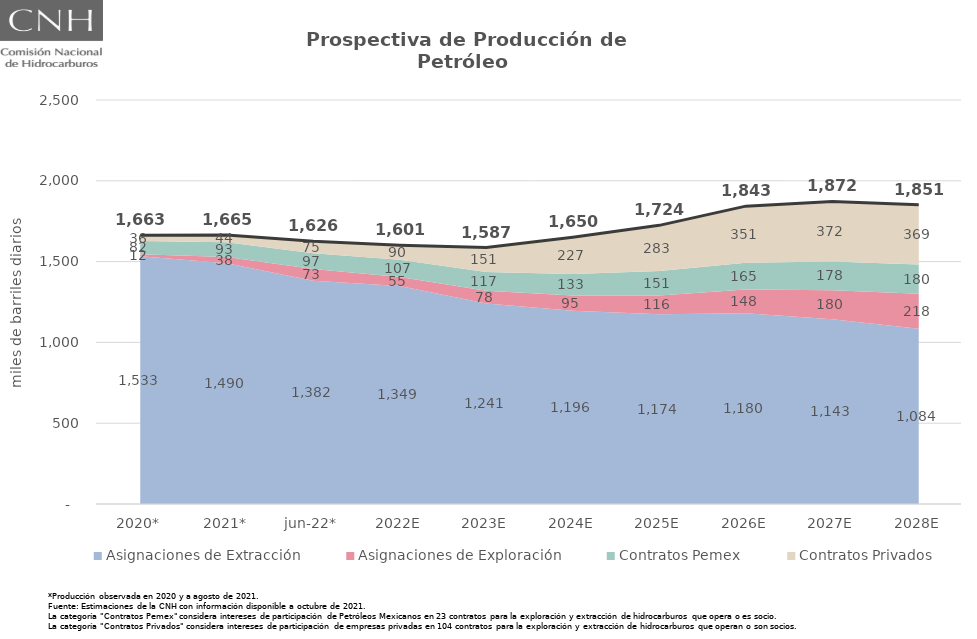
| Category | Total |
|---|---|
| 2020* | 1663.042 |
| 2021* | 1664.708 |
| jun-22* | 1626.428 |
| 2022E | 1601.144 |
| 2023E | 1587.114 |
| 2024E | 1650.014 |
| 2025E | 1724.282 |
| 2026E | 1843.205 |
| 2027E | 1872.17 |
| 2028E | 1851.363 |